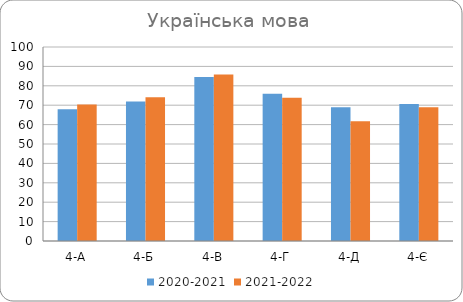
| Category | 2020-2021 | 2021-2022 |
|---|---|---|
| 4-А | 67.9 | 70.4 |
| 4-Б | 71.9 | 74.1 |
| 4-В | 84.5 | 85.8 |
| 4-Г | 75.9 | 73.9 |
| 4-Д | 68.9 | 61.7 |
| 4-Є | 70.6 | 69 |